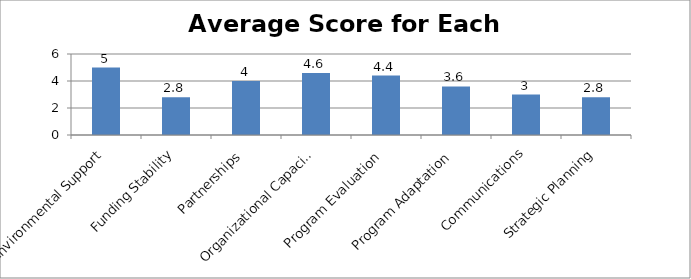
| Category | Average Score for Domain |
|---|---|
| Environmental Support | 5 |
| Funding Stability | 2.8 |
| Partnerships | 4 |
| Organizational Capacity | 4.6 |
| Program Evaluation | 4.4 |
| Program Adaptation | 3.6 |
| Communications | 3 |
| Strategic Planning | 2.8 |